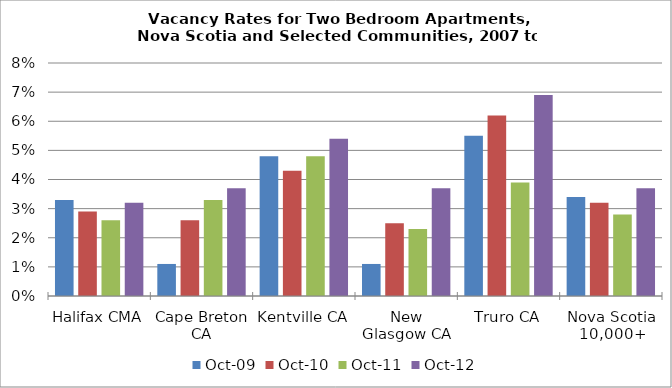
| Category | Oct-09 | Oct-10 | Oct-11 | Oct-12 |
|---|---|---|---|---|
| Halifax CMA | 0.033 | 0.029 | 0.026 | 0.032 |
| Cape Breton CA | 0.011 | 0.026 | 0.033 | 0.037 |
| Kentville CA | 0.048 | 0.043 | 0.048 | 0.054 |
| New Glasgow CA | 0.011 | 0.025 | 0.023 | 0.037 |
| Truro CA | 0.055 | 0.062 | 0.039 | 0.069 |
| Nova Scotia 10,000+ | 0.034 | 0.032 | 0.028 | 0.037 |